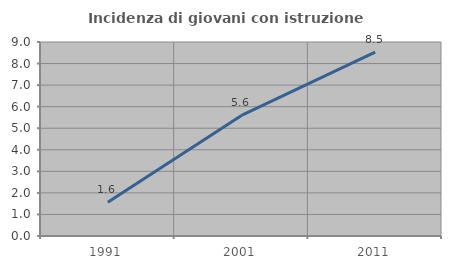
| Category | Incidenza di giovani con istruzione universitaria |
|---|---|
| 1991.0 | 1.562 |
| 2001.0 | 5.594 |
| 2011.0 | 8.527 |